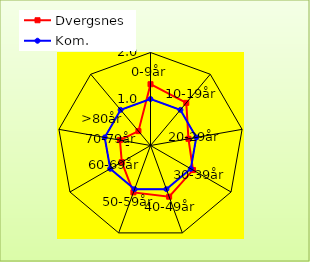
| Category | Dvergsnes | Kom. |
|---|---|---|
| 0-9år | 1.318 | 1 |
| 10-19år | 1.197 | 1 |
| 20-29år | 0.829 | 1 |
| 30-39år | 1.056 | 1 |
| 40-49år | 1.172 | 1 |
| 50-59år | 1.073 | 1 |
| 60-69år | 0.713 | 1 |
| 70-79år | 0.667 | 1 |
| >80år | 0.404 | 1 |